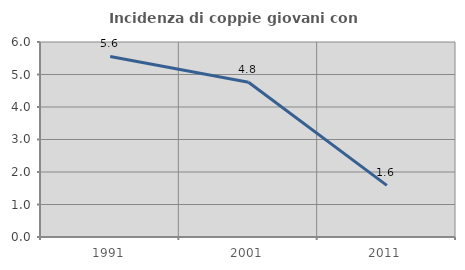
| Category | Incidenza di coppie giovani con figli |
|---|---|
| 1991.0 | 5.556 |
| 2001.0 | 4.762 |
| 2011.0 | 1.587 |